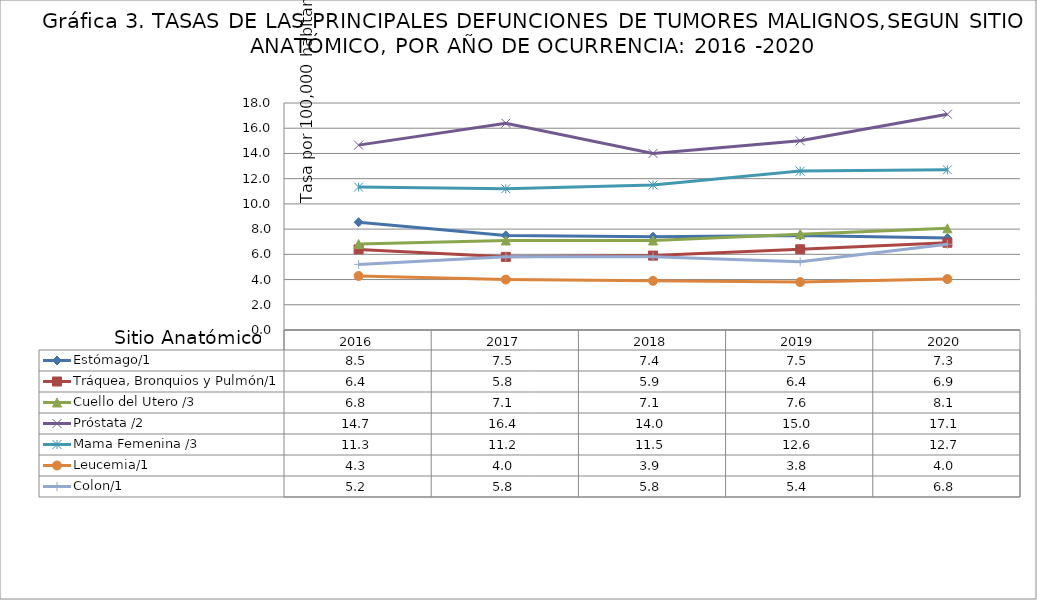
| Category | Estómago/1 | Tráquea, Bronquios y Pulmón/1 | Cuello del Utero /3 | Próstata /2 | Mama Femenina /3 | Leucemia/1 | Colon/1 |
|---|---|---|---|---|---|---|---|
| 2016.0 | 8.546 | 6.391 | 6.813 | 14.659 | 11.338 | 4.285 | 5.202 |
| 2017.0 | 7.5 | 5.8 | 7.1 | 16.4 | 11.2 | 4 | 5.8 |
| 2018.0 | 7.4 | 5.9 | 7.1 | 14 | 11.5 | 3.9 | 5.8 |
| 2019.0 | 7.5 | 6.4 | 7.6 | 15 | 12.599 | 3.8 | 5.404 |
| 2020.0 | 7.29 | 6.92 | 8.06 | 17.11 | 12.7 | 4.04 | 6.8 |